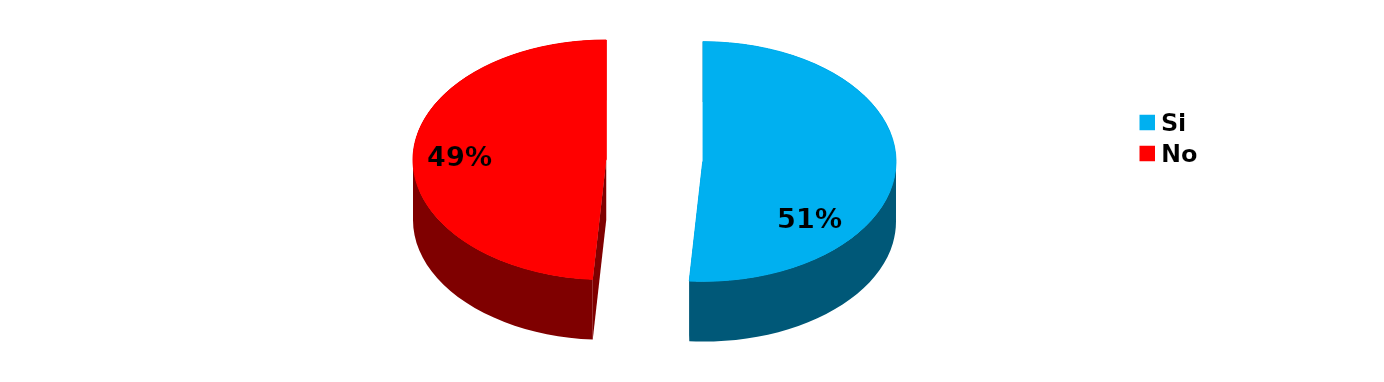
| Category | Series 0 |
|---|---|
| Si | 23 |
| No | 22 |